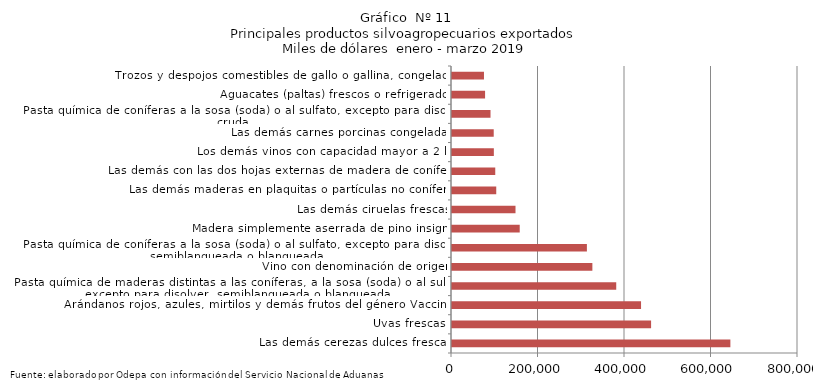
| Category | Series 0 |
|---|---|
| Las demás cerezas dulces frescas | 643649.04 |
| Uvas frescas | 460323.803 |
| Arándanos rojos, azules, mirtilos y demás frutos del género Vaccinium | 437097.221 |
| Pasta química de maderas distintas a las coníferas, a la sosa (soda) o al sulfato, excepto para disolver, semiblanqueada o blanqueada | 379730.915 |
| Vino con denominación de origen | 324563.168 |
| Pasta química de coníferas a la sosa (soda) o al sulfato, excepto para disolver, semiblanqueada o blanqueada | 311892.028 |
| Madera simplemente aserrada de pino insigne | 156592.748 |
| Las demás ciruelas frescas | 146831.316 |
| Las demás maderas en plaquitas o partículas no coníferas | 102297.343 |
| Las demás con las dos hojas externas de madera de coníferas | 100011.927 |
| Los demás vinos con capacidad mayor a 2 lts | 96755.785 |
| Las demás carnes porcinas congeladas | 96466.79 |
| Pasta química de coníferas a la sosa (soda) o al sulfato, excepto para disolver, cruda | 89039.708 |
| Aguacates (paltas) frescos o refrigerados | 76487.785 |
| Trozos y despojos comestibles de gallo o gallina, congelados | 73948 |